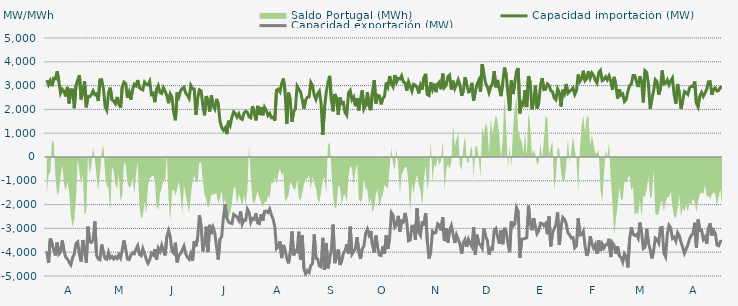
| Category | Capacidad importación (MW) | Capacidad exportación (MW) |
|---|---|---|
| 0 | 3230.042 | -3961.875 |
| 1900-01-01 | 3034.208 | -4453.125 |
| 1900-01-02 | 3206.25 | -3423.75 |
| 1900-01-03 | 2977.5 | -3611.25 |
| 1900-01-04 | 3309.375 | -3911.25 |
| 1900-01-05 | 3288.75 | -4138.125 |
| 1900-01-06 | 3602.833 | -3596.25 |
| 1900-01-07 | 3174.375 | -4080 |
| 1900-01-08 | 2683.667 | -3991.875 |
| 1900-01-09 | 2848.875 | -3504.833 |
| 1900-01-10 | 2758.542 | -3938.333 |
| 1900-01-11 | 2545.417 | -4209.375 |
| 1900-01-12 | 2945.625 | -4278.75 |
| 1900-01-13 | 2252.5 | -4423.125 |
| 1900-01-14 | 2829.375 | -4533.75 |
| 1900-01-15 | 2820.917 | -4235.625 |
| 1900-01-16 | 2048.125 | -4081.208 |
| 1900-01-17 | 3003.75 | -3632.292 |
| 1900-01-18 | 3232.5 | -3565.625 |
| 1900-01-19 | 3440.625 | -4096.875 |
| 1900-01-20 | 2422.5 | -4393.125 |
| 1900-01-21 | 2763.958 | -3487.5 |
| 1900-01-22 | 3183.75 | -3943.125 |
| 1900-01-23 | 2087.083 | -4443.75 |
| 1900-01-24 | 2547 | -2925.75 |
| 1900-01-25 | 2531.667 | -3560.625 |
| 1900-01-26 | 2628.75 | -3590.625 |
| 1900-01-27 | 2778.75 | -3480 |
| 1900-01-28 | 2617.292 | -2701.792 |
| 1900-01-29 | 2655 | -4141.875 |
| 1900-01-30 | 2355.417 | -4288.125 |
| 1900-01-31 | 3240.75 | -4318.125 |
| 1900-02-01 | 3247.5 | -3676.875 |
| 1900-02-02 | 2878.042 | -4025.625 |
| 1900-02-03 | 2109.167 | -4269.375 |
| 1900-02-04 | 1961.042 | -4299.375 |
| 1900-02-05 | 2710.208 | -4003.125 |
| 1900-02-06 | 2916 | -4248.333 |
| 1900-02-07 | 2401.875 | -4179.375 |
| 1900-02-08 | 2351.25 | -4286.25 |
| 1900-02-09 | 2238.75 | -4192.5 |
| 1900-02-10 | 2520 | -4265.625 |
| 1900-02-11 | 2227.5 | -4108.125 |
| 1900-02-12 | 2070.583 | -4246.875 |
| 1900-02-13 | 2958.75 | -3892.5 |
| 1900-02-14 | 3146.25 | -3508.125 |
| 1900-02-15 | 3087.5 | -3877.5 |
| 1900-02-16 | 2487.5 | -4284.375 |
| 1900-02-17 | 2722.5 | -4310.625 |
| 1900-02-18 | 2411.25 | -4125 |
| 1900-02-19 | 2840.5 | -4025.625 |
| 1900-02-20 | 3054.5 | -4066.875 |
| 1900-02-21 | 2992.958 | -3879.375 |
| 1900-02-22 | 3232.5 | -3729.375 |
| 1900-02-23 | 2917.5 | -4085.625 |
| 1900-02-24 | 2853.75 | -4141.875 |
| 1900-02-25 | 2819.458 | -3849.375 |
| 1900-02-26 | 3145.042 | -4061.25 |
| 1900-02-27 | 3046.958 | -4290 |
| 1900-02-28 | 3028.125 | -4468.125 |
| 1900-02-28 | 3180.542 | -4331.25 |
| 1900-03-01 | 2624.958 | -4042.5 |
| 1900-03-02 | 2676.25 | -4115.625 |
| 1900-03-03 | 2302.5 | -3873.75 |
| 1900-03-04 | 2854.208 | -4308.75 |
| 1900-03-05 | 2997.833 | -3837.167 |
| 1900-03-06 | 2709.375 | -3973.125 |
| 1900-03-07 | 2670 | -3712.958 |
| 1900-03-08 | 2913.75 | -3958.125 |
| 1900-03-09 | 2765.625 | -4134.375 |
| 1900-03-10 | 2587.5 | -3352.5 |
| 1900-03-11 | 2261.25 | -3093.75 |
| 1900-03-12 | 2651.25 | -3345.208 |
| 1900-03-13 | 2510.625 | -3963.75 |
| 1900-03-14 | 1885.875 | -4044.375 |
| 1900-03-15 | 1541.5 | -3601.375 |
| 1900-03-16 | 2707.5 | -4426.875 |
| 1900-03-17 | 2516.25 | -4128.75 |
| 1900-03-18 | 2775 | -4059.375 |
| 1900-03-19 | 2883.75 | -3906.667 |
| 1900-03-20 | 2930.625 | -3742.5 |
| 1900-03-21 | 2685 | -4061.25 |
| 1900-03-22 | 2596.875 | -4213.125 |
| 1900-03-23 | 2463.75 | -4295.625 |
| 1900-03-24 | 3005.625 | -4065 |
| 1900-03-25 | 2861.25 | -4370.625 |
| 1900-03-26 | 2855.083 | -3533.583 |
| 1900-03-27 | 1775.625 | -3751.875 |
| 1900-03-28 | 2478.75 | -3391.875 |
| 1900-03-29 | 2821.875 | -2444.375 |
| 1900-03-30 | 2782.5 | -2903.75 |
| 1900-03-31 | 2169.375 | -3964.667 |
| 1900-04-01 | 1751.292 | -3614.625 |
| 1900-04-02 | 2561.25 | -2926.875 |
| 1900-04-03 | 2356.875 | -3995.625 |
| 1900-04-04 | 1911.125 | -2849.625 |
| 1900-04-05 | 2583.75 | -3240 |
| 1900-04-06 | 2157.125 | -2962.917 |
| 1900-04-07 | 2021.375 | -3195.625 |
| 1900-04-08 | 2439.375 | -3776.25 |
| 1900-04-09 | 2235 | -4305 |
| 1900-04-10 | 1509.375 | -3436.875 |
| 1900-04-11 | 1230.208 | -3360 |
| 1900-04-12 | 1123.125 | -2546.875 |
| 1900-04-13 | 1221.25 | -1995.875 |
| 1900-04-14 | 962.083 | -2563.125 |
| 1900-04-15 | 1523.958 | -2728.125 |
| 1900-04-16 | 1344.375 | -2776.875 |
| 1900-04-17 | 1676.25 | -2795.625 |
| 1900-04-18 | 1899.375 | -2411.25 |
| 1900-04-19 | 1826.25 | -2461.875 |
| 1900-04-20 | 1680 | -2529.375 |
| 1900-04-21 | 1815 | -2662.5 |
| 1900-04-22 | 1621.458 | -2287.5 |
| 1900-04-23 | 1577.083 | -2818.125 |
| 1900-04-24 | 1846.875 | -2643.75 |
| 1900-04-25 | 1923.75 | -2656.875 |
| 1900-04-26 | 1875 | -2195.625 |
| 1900-04-27 | 1683.75 | -2330.625 |
| 1900-04-28 | 1646.25 | -2746.875 |
| 1900-04-29 | 2137.5 | -2580.5 |
| 1900-04-30 | 1860 | -2620.625 |
| 1900-05-01 | 1537.5 | -2371.875 |
| 1900-05-02 | 2149.292 | -2771.25 |
| 1900-05-03 | 1766.25 | -2801.25 |
| 1900-05-04 | 2097.75 | -2405.625 |
| 1900-05-05 | 1753.125 | -2676.75 |
| 1900-05-06 | 2090.625 | -2285.292 |
| 1900-05-07 | 1956.125 | -2274.75 |
| 1900-05-08 | 1743.75 | -2330.125 |
| 1900-05-09 | 1833.75 | -2185.875 |
| 1900-05-10 | 1651.875 | -2439.375 |
| 1900-05-11 | 1677 | -2608.125 |
| 1900-05-12 | 1526.25 | -2926.875 |
| 1900-05-13 | 2806.875 | -3847.5 |
| 1900-05-14 | 2853.75 | -3770.625 |
| 1900-05-15 | 2739.375 | -3542.5 |
| 1900-05-16 | 3086.25 | -4248.75 |
| 1900-05-17 | 3294.375 | -3694.583 |
| 1900-05-18 | 2737.5 | -3914.167 |
| 1900-05-19 | 1388.958 | -4258.125 |
| 1900-05-20 | 2705.625 | -4468.125 |
| 1900-05-21 | 2414.25 | -4032.292 |
| 1900-05-22 | 1474.5 | -3127.5 |
| 1900-05-23 | 1904.833 | -4134.375 |
| 1900-05-24 | 2018.333 | -3933.75 |
| 1900-05-25 | 2978.625 | -3980.625 |
| 1900-05-26 | 2851.875 | -3137.917 |
| 1900-05-27 | 2745 | -4327.5 |
| 1900-05-28 | 2411.25 | -3294.375 |
| 1900-05-29 | 2032.5 | -4693.125 |
| 1900-05-30 | 2394.375 | -4916.25 |
| 1900-05-31 | 2506.875 | -4770 |
| 1900-06-01 | 2527.5 | -4845 |
| 1900-06-02 | 3132.875 | -4556.25 |
| 1900-06-03 | 3001.875 | -4479.375 |
| 1900-06-04 | 2597 | -3253.75 |
| 1900-06-05 | 2415.833 | -4258.125 |
| 1900-06-06 | 2655 | -4284.375 |
| 1900-06-07 | 2764.458 | -4576.875 |
| 1900-06-08 | 2248.625 | -4616.25 |
| 1900-06-09 | 931.875 | -3396.042 |
| 1900-06-10 | 2074.792 | -4740 |
| 1900-06-11 | 2707.5 | -3624.375 |
| 1900-06-12 | 3118.125 | -4681.875 |
| 1900-06-13 | 3408.75 | -4280.625 |
| 1900-06-14 | 2415 | -3889.583 |
| 1900-06-15 | 1918.917 | -2840.25 |
| 1900-06-16 | 2645.125 | -4460.625 |
| 1900-06-17 | 2469.792 | -4186.875 |
| 1900-06-18 | 1772.542 | -3887.917 |
| 1900-06-19 | 2498.667 | -4538.125 |
| 1900-06-20 | 2245.542 | -4370 |
| 1900-06-21 | 2285.625 | -4056.25 |
| 1900-06-22 | 1862.708 | -3941.667 |
| 1900-06-23 | 1755.417 | -3663.125 |
| 1900-06-24 | 2699.583 | -4063.125 |
| 1900-06-25 | 2797.5 | -2925.625 |
| 1900-06-26 | 2403.333 | -4085.625 |
| 1900-06-27 | 2516.25 | -3971.25 |
| 1900-06-28 | 2135.625 | -3854.792 |
| 1900-06-29 | 2477.125 | -3369.292 |
| 1900-06-30 | 1956.292 | -3999.375 |
| 1900-07-01 | 2427.5 | -4280 |
| 1900-07-02 | 2798 | -3856.875 |
| 1900-07-03 | 2018.125 | -3744.583 |
| 1900-07-04 | 2168.958 | -3208.75 |
| 1900-07-05 | 2728.125 | -3034.375 |
| 1900-07-06 | 2131.75 | -3278.125 |
| 1900-07-07 | 1966.875 | -3106.458 |
| 1900-07-08 | 2738.083 | -3703.375 |
| 1900-07-09 | 3229.167 | -4012.5 |
| 1900-07-10 | 2249.792 | -3300.833 |
| 1900-07-11 | 2592.917 | -3809.792 |
| 1900-07-12 | 2566.25 | -4116.667 |
| 1900-07-13 | 2212.5 | -4138.708 |
| 1900-07-14 | 2464.375 | -3755.833 |
| 1900-07-15 | 2551.042 | -4061.25 |
| 1900-07-16 | 3133.5 | -3295.833 |
| 1900-07-17 | 2953.75 | -3854.167 |
| 1900-07-18 | 3401.25 | -3375.917 |
| 1900-07-19 | 3082.5 | -2336.25 |
| 1900-07-20 | 2949.375 | -2439.375 |
| 1900-07-21 | 3446.25 | -2947.5 |
| 1900-07-22 | 3138.75 | -2840.625 |
| 1900-07-23 | 3305 | -2472.958 |
| 1900-07-24 | 3276.125 | -3134.625 |
| 1900-07-25 | 3410.625 | -2685.417 |
| 1900-07-26 | 3153.75 | -2727.292 |
| 1900-07-27 | 3110.625 | -2351.25 |
| 1900-07-28 | 2786.458 | -2737.5 |
| 1900-07-29 | 3159.375 | -3519.375 |
| 1900-07-30 | 2974.6 | -3488.4 |
| 1900-07-31 | 2766.667 | -2906.917 |
| 1900-08-01 | 3058.125 | -2902.5 |
| 1900-08-02 | 3018.75 | -3474.375 |
| 1900-08-03 | 2925.625 | -2158.375 |
| 1900-08-04 | 2670.667 | -3157.5 |
| 1900-08-05 | 3015 | -3296.25 |
| 1900-08-06 | 2835.25 | -2693.125 |
| 1900-08-07 | 3337.5 | -2882.083 |
| 1900-08-08 | 3493.125 | -2358.75 |
| 1900-08-09 | 2626.042 | -3555 |
| 1900-08-10 | 2583.542 | -4267.5 |
| 1900-08-11 | 3140.625 | -3948.75 |
| 1900-08-12 | 2844.375 | -3122.5 |
| 1900-08-13 | 3082.5 | -3200.625 |
| 1900-08-14 | 2726.25 | -3170.625 |
| 1900-08-15 | 3071.25 | -2806.875 |
| 1900-08-16 | 3151.875 | -2865 |
| 1900-08-17 | 2845.417 | -3084.375 |
| 1900-08-18 | 3500.625 | -2536.875 |
| 1900-08-19 | 2921.75 | -3531.625 |
| 1900-08-20 | 3012.625 | -2985.75 |
| 1900-08-21 | 3378.75 | -3590.625 |
| 1900-08-22 | 3442.5 | -3078.75 |
| 1900-08-23 | 2829.167 | -2881.042 |
| 1900-08-24 | 3205.833 | -3234.375 |
| 1900-08-25 | 2873.625 | -3613.125 |
| 1900-08-26 | 3038.333 | -3270 |
| 1900-08-27 | 3245.625 | -3459.375 |
| 1900-08-28 | 3029.167 | -3656.25 |
| 1900-08-29 | 2571.042 | -4057.5 |
| 1900-08-30 | 2766.125 | -3596.417 |
| 1900-08-31 | 3348.75 | -3465 |
| 1900-09-01 | 3046.333 | -3774.375 |
| 1900-09-02 | 2732.708 | -3460.042 |
| 1900-09-03 | 2770.75 | -3616.875 |
| 1900-09-04 | 3116.25 | -3757.75 |
| 1900-09-05 | 2370.5 | -2949.375 |
| 1900-09-06 | 2758.625 | -4102.5 |
| 1900-09-07 | 3054.167 | -3262.5 |
| 1900-09-08 | 3221.875 | -3637.5 |
| 1900-09-09 | 2734.792 | -3695.625 |
| 1900-09-10 | 3901.875 | -3830.625 |
| 1900-09-11 | 3478.125 | -3007.5 |
| 1900-09-12 | 3100.208 | -3343.125 |
| 1900-09-13 | 2951.458 | -3500.625 |
| 1900-09-14 | 2703.125 | -4100.625 |
| 1900-09-15 | 2949.667 | -3832.5 |
| 1900-09-16 | 3092.292 | -3864.375 |
| 1900-09-17 | 3609.375 | -3088.125 |
| 1900-09-18 | 2928.75 | -3003.75 |
| 1900-09-19 | 3238.333 | -3346.875 |
| 1900-09-20 | 2865.417 | -3639.375 |
| 1900-09-21 | 2557.917 | -3067.5 |
| 1900-09-22 | 3131.667 | -3665.625 |
| 1900-09-23 | 3761.25 | -2973.625 |
| 1900-09-24 | 3468.542 | -3153.75 |
| 1900-09-25 | 2673.75 | -3622.5 |
| 1900-09-26 | 1945.625 | -3999.375 |
| 1900-09-27 | 3222.083 | -2703.875 |
| 1900-09-28 | 2645.458 | -2900.625 |
| 1900-09-29 | 3097.5 | -2827.5 |
| 1900-09-30 | 3595.208 | -2128.75 |
| 1900-10-01 | 3741.458 | -2283.75 |
| 1900-10-02 | 1833.125 | -4242.5 |
| 1900-10-03 | 2294.25 | -3457.125 |
| 1900-10-04 | 2210.833 | -3444.375 |
| 1900-10-05 | 2808.75 | -3420 |
| 1900-10-06 | 2098.083 | -3391.875 |
| 1900-10-07 | 3404.792 | -2041.875 |
| 1900-10-08 | 3136.875 | -2790.292 |
| 1900-10-09 | 2001.25 | -3075.75 |
| 1900-10-10 | 2334.583 | -2570.625 |
| 1900-10-11 | 2998.542 | -2932.5 |
| 1900-10-12 | 2041.583 | -3219.375 |
| 1900-10-13 | 2261.875 | -3091.875 |
| 1900-10-14 | 3017.292 | -2780.625 |
| 1900-10-15 | 3316.667 | -2796 |
| 1900-10-16 | 2831.875 | -2880.375 |
| 1900-10-17 | 2848.875 | -2791.375 |
| 1900-10-18 | 3072.083 | -3242.5 |
| 1900-10-19 | 3008.75 | -2494.125 |
| 1900-10-20 | 2789.75 | -3753.75 |
| 1900-10-21 | 2740.75 | -3208.125 |
| 1900-10-22 | 2484.167 | -3015 |
| 1900-10-23 | 2405.083 | -2845.208 |
| 1900-10-24 | 2862.542 | -2330.625 |
| 1900-10-25 | 2704.875 | -3693.75 |
| 1900-10-26 | 2121.458 | -2932.25 |
| 1900-10-27 | 2826.875 | -2536.458 |
| 1900-10-28 | 2666.25 | -2617.875 |
| 1900-10-29 | 3068.375 | -2797.625 |
| 1900-10-30 | 2681.458 | -3181.875 |
| 1900-10-31 | 2762.167 | -3268.125 |
| 1900-11-01 | 2816.458 | -3403.125 |
| 1900-11-02 | 2908.75 | -3388.125 |
| 1900-11-03 | 2628.458 | -3817.5 |
| 1900-11-04 | 2784.5 | -3729.375 |
| 1900-11-05 | 3466.875 | -2575.375 |
| 1900-11-06 | 3180 | -3284.375 |
| 1900-11-07 | 3301.25 | -3251.25 |
| 1900-11-08 | 3624.375 | -3114.375 |
| 1900-11-09 | 3203.333 | -3733.125 |
| 1900-11-10 | 3288.125 | -4155 |
| 1900-11-11 | 3606.25 | -3943.125 |
| 1900-11-12 | 3313.75 | -3335.625 |
| 1900-11-13 | 3531.417 | -3646.875 |
| 1900-11-14 | 3433.125 | -3826.875 |
| 1900-11-15 | 3223.542 | -3673.333 |
| 1900-11-16 | 3103.75 | -4066.875 |
| 1900-11-17 | 3546.25 | -3496.875 |
| 1900-11-18 | 3638.5 | -3952.5 |
| 1900-11-19 | 3210 | -3661.875 |
| 1900-11-20 | 3255.417 | -3826.875 |
| 1900-11-21 | 3367.5 | -3690 |
| 1900-11-22 | 3244.5 | -3684.375 |
| 1900-11-23 | 3411.458 | -3435 |
| 1900-11-24 | 3192.708 | -4203.75 |
| 1900-11-25 | 2825 | -3605.625 |
| 1900-11-26 | 3365.667 | -3718.625 |
| 1900-11-27 | 3014.375 | -4063.125 |
| 1900-11-28 | 2458.292 | -3762 |
| 1900-11-29 | 2845.5 | -4151.25 |
| 1900-11-30 | 2597.292 | -4215 |
| 1900-12-01 | 2650.375 | -4415.625 |
| 1900-12-02 | 2331.042 | -4066.875 |
| 1900-12-03 | 2415.625 | -4185 |
| 1900-12-04 | 2763.875 | -4638.75 |
| 1900-12-05 | 2996.042 | -3465 |
| 1900-12-06 | 3054.375 | -2960.625 |
| 1900-12-07 | 3421.875 | -3238.875 |
| 1900-12-08 | 3422.25 | -3301.458 |
| 1900-12-09 | 3168.75 | -3257.708 |
| 1900-12-10 | 2940.75 | -3407.5 |
| 1900-12-11 | 3391.875 | -2758.75 |
| 1900-12-12 | 3159.375 | -3175.208 |
| 1900-12-13 | 2294.792 | -3843.75 |
| 1900-12-14 | 3620.625 | -3793.125 |
| 1900-12-15 | 3550.208 | -3016.875 |
| 1900-12-16 | 3036.458 | -3616.875 |
| 1900-12-17 | 2023.333 | -3886.25 |
| 1900-12-18 | 2440.208 | -4263.75 |
| 1900-12-19 | 2764.167 | -3943.125 |
| 1900-12-20 | 3245.625 | -3410.667 |
| 1900-12-21 | 3161.25 | -3470.625 |
| 1900-12-22 | 2621.458 | -3614.625 |
| 1900-12-23 | 2861.25 | -2975.958 |
| 1900-12-24 | 3635.217 | -2962.391 |
| 1900-12-25 | 3071.083 | -4052.75 |
| 1900-12-26 | 3103.625 | -4196.25 |
| 1900-12-27 | 3238.125 | -3235.75 |
| 1900-12-28 | 3031.875 | -2868.708 |
| 1900-12-29 | 3202.5 | -2981.292 |
| 1900-12-30 | 3320.625 | -3422.292 |
| 1900-12-31 | 2615.625 | -3370.417 |
| 1901-01-01 | 2244.375 | -3535.625 |
| 1901-01-02 | 3067.5 | -3176.25 |
| 1901-01-03 | 2692.458 | -3306.875 |
| 1901-01-04 | 2025 | -3576.042 |
| 1901-01-05 | 2373.833 | -3795 |
| 1901-01-06 | 2750.458 | -4045 |
| 1901-01-07 | 2704.167 | -3868.417 |
| 1901-01-08 | 2628.75 | -3691.667 |
| 1901-01-09 | 2910 | -3448.125 |
| 1901-01-10 | 2971.875 | -3293.375 |
| 1901-01-11 | 2958.5 | -3229.167 |
| 1901-01-12 | 3174.375 | -2764.583 |
| 1901-01-13 | 2253.75 | -3813.75 |
| 1901-01-14 | 2100 | -2628.667 |
| 1901-01-15 | 2557.5 | -3088.333 |
| 1901-01-16 | 2713.125 | -3062.25 |
| 1901-01-17 | 2546.875 | -3463.625 |
| 1901-01-18 | 2686.458 | -3359.458 |
| 1901-01-19 | 2850 | -3646.042 |
| 1901-01-20 | 3159.375 | -2992.292 |
| 1901-01-21 | 3166.875 | -2793.125 |
| 1901-01-22 | 2613.75 | -3298.833 |
| 1901-01-23 | 2857.5 | -3089.625 |
| 1901-01-24 | 2903.875 | -3210.125 |
| 1901-01-25 | 2772 | -3696.792 |
| 1901-01-26 | 2797.5 | -3731.25 |
| 1901-01-27 | 2930.625 | -3545.625 |
| 1901-01-28 | 2932.5 | -3541.875 |